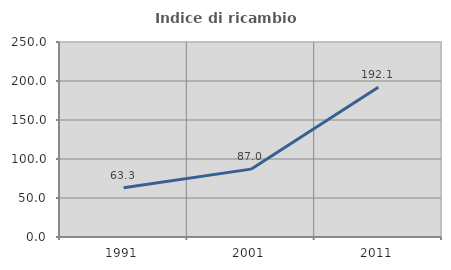
| Category | Indice di ricambio occupazionale  |
|---|---|
| 1991.0 | 63.259 |
| 2001.0 | 87.003 |
| 2011.0 | 192.061 |